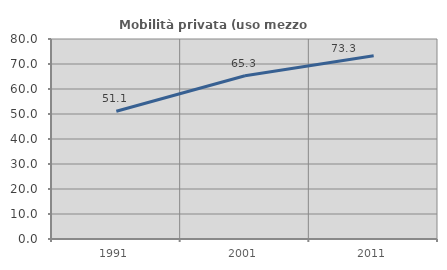
| Category | Mobilità privata (uso mezzo privato) |
|---|---|
| 1991.0 | 51.099 |
| 2001.0 | 65.306 |
| 2011.0 | 73.32 |